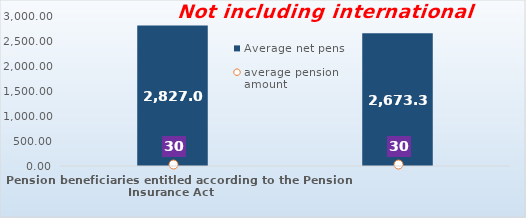
| Category | Average net pension  |
|---|---|
| Pension beneficiaries entitled according to the Pension Insurance Act   | 2827.07 |
| Pension beneficiaries entitled to pension FOR THE FIRST TIME in 2020 according to the Pension Insurance Act  - NEW BENEFICIARIES | 2673.363 |